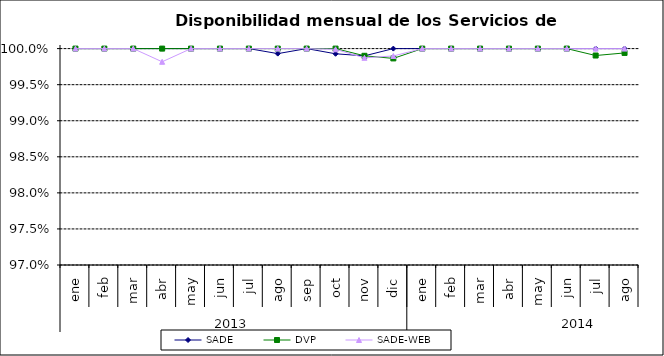
| Category | SADE | DVP | SADE-WEB |
|---|---|---|---|
| 0 | 1 | 1 | 1 |
| 1 | 1 | 1 | 1 |
| 2 | 1 | 1 | 1 |
| 3 | 1 | 1 | 0.998 |
| 4 | 1 | 1 | 1 |
| 5 | 1 | 1 | 1 |
| 6 | 1 | 1 | 1 |
| 7 | 0.999 | 1 | 1 |
| 8 | 1 | 1 | 1 |
| 9 | 0.999 | 1 | 1 |
| 10 | 0.999 | 0.999 | 0.999 |
| 11 | 1 | 0.999 | 0.999 |
| 12 | 1 | 1 | 1 |
| 13 | 1 | 1 | 1 |
| 14 | 1 | 1 | 1 |
| 15 | 1 | 1 | 1 |
| 16 | 1 | 1 | 1 |
| 17 | 1 | 1 | 1 |
| 18 | 1 | 0.999 | 1 |
| 19 | 1 | 0.999 | 1 |